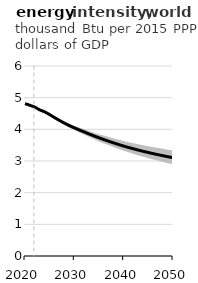
| Category | Series 0 |
|---|---|
| 2020.0 | 4.813 |
| 2021.0 | 4.759 |
| 2022.0 | 4.702 |
| 2023.0 | 4.613 |
| 2024.0 | 4.552 |
| 2025.0 | 4.465 |
| 2026.0 | 4.369 |
| 2027.0 | 4.28 |
| 2028.0 | 4.194 |
| 2029.0 | 4.117 |
| 2030.0 | 4.046 |
| 2031.0 | 3.981 |
| 2032.0 | 3.918 |
| 2033.0 | 3.852 |
| 2034.0 | 3.791 |
| 2035.0 | 3.733 |
| 2036.0 | 3.676 |
| 2037.0 | 3.622 |
| 2038.0 | 3.57 |
| 2039.0 | 3.52 |
| 2040.0 | 3.471 |
| 2041.0 | 3.427 |
| 2042.0 | 3.384 |
| 2043.0 | 3.343 |
| 2044.0 | 3.304 |
| 2045.0 | 3.267 |
| 2046.0 | 3.232 |
| 2047.0 | 3.198 |
| 2048.0 | 3.166 |
| 2049.0 | 3.134 |
| 2050.0 | 3.104 |